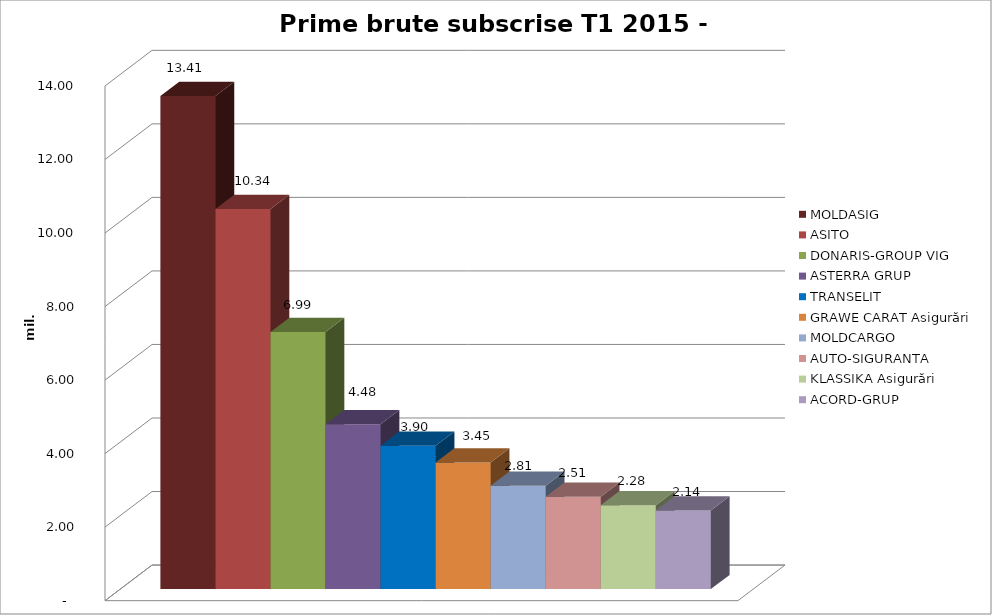
| Category | MOLDASIG  | ASITO  | DONARIS-GROUP VIG | ASTERRA GRUP  | TRANSELIT  | GRAWE CARAT Asigurări | MOLDCARGO  | AUTO-SIGURANTA  | KLASSIKA Asigurări  | ACORD-GRUP  |
|---|---|---|---|---|---|---|---|---|---|---|
| 0 | 13.411 | 10.336 | 6.99 | 4.484 | 3.899 | 3.445 | 2.809 | 2.514 | 2.282 | 2.141 |